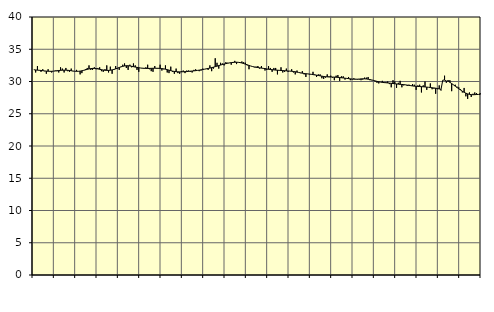
| Category | Piggar | Series 1 |
|---|---|---|
| nan | 31.8 | 31.82 |
| 1.0 | 31.4 | 31.79 |
| 1.0 | 32.4 | 31.76 |
| 1.0 | 31.7 | 31.74 |
| 1.0 | 31.5 | 31.71 |
| 1.0 | 31.9 | 31.68 |
| 1.0 | 31.6 | 31.64 |
| 1.0 | 31.2 | 31.61 |
| 1.0 | 31.9 | 31.59 |
| 1.0 | 31.6 | 31.58 |
| 1.0 | 31.4 | 31.58 |
| 1.0 | 31.6 | 31.6 |
| nan | 31.7 | 31.63 |
| 2.0 | 31.6 | 31.67 |
| 2.0 | 31.4 | 31.7 |
| 2.0 | 32.2 | 31.73 |
| 2.0 | 32 | 31.75 |
| 2.0 | 31.4 | 31.76 |
| 2.0 | 32.1 | 31.76 |
| 2.0 | 31.6 | 31.74 |
| 2.0 | 31.5 | 31.71 |
| 2.0 | 32 | 31.67 |
| 2.0 | 31.6 | 31.62 |
| 2.0 | 31.6 | 31.59 |
| nan | 31.8 | 31.58 |
| 3.0 | 31.6 | 31.58 |
| 3.0 | 31.1 | 31.61 |
| 3.0 | 31.3 | 31.66 |
| 3.0 | 31.7 | 31.73 |
| 3.0 | 31.9 | 31.8 |
| 3.0 | 32.1 | 31.88 |
| 3.0 | 32.5 | 31.95 |
| 3.0 | 31.8 | 32 |
| 3.0 | 31.8 | 32.03 |
| 3.0 | 32.2 | 32.03 |
| 3.0 | 31.9 | 32 |
| nan | 32.1 | 31.95 |
| 4.0 | 32.2 | 31.89 |
| 4.0 | 31.6 | 31.83 |
| 4.0 | 31.5 | 31.78 |
| 4.0 | 31.9 | 31.74 |
| 4.0 | 32.5 | 31.72 |
| 4.0 | 31.4 | 31.72 |
| 4.0 | 32.3 | 31.75 |
| 4.0 | 31.2 | 31.8 |
| 4.0 | 31.8 | 31.87 |
| 4.0 | 32.4 | 31.96 |
| 4.0 | 32 | 32.06 |
| nan | 31.8 | 32.17 |
| 5.0 | 32.3 | 32.27 |
| 5.0 | 32.6 | 32.35 |
| 5.0 | 32.8 | 32.41 |
| 5.0 | 32.1 | 32.45 |
| 5.0 | 31.8 | 32.44 |
| 5.0 | 32.6 | 32.41 |
| 5.0 | 32.2 | 32.36 |
| 5.0 | 32.8 | 32.3 |
| 5.0 | 32.5 | 32.24 |
| 5.0 | 31.8 | 32.19 |
| 5.0 | 31.5 | 32.14 |
| nan | 32.1 | 32.09 |
| 6.0 | 32.1 | 32.06 |
| 6.0 | 32.1 | 32.04 |
| 6.0 | 32.2 | 32.03 |
| 6.0 | 32.6 | 32.02 |
| 6.0 | 31.9 | 32.03 |
| 6.0 | 31.6 | 32.04 |
| 6.0 | 31.5 | 32.05 |
| 6.0 | 32.4 | 32.06 |
| 6.0 | 32 | 32.05 |
| 6.0 | 32.1 | 32.04 |
| 6.0 | 32.6 | 32.03 |
| nan | 31.7 | 32 |
| 7.0 | 31.9 | 31.96 |
| 7.0 | 32.5 | 31.91 |
| 7.0 | 31.4 | 31.84 |
| 7.0 | 31.3 | 31.76 |
| 7.0 | 32.3 | 31.68 |
| 7.0 | 31.5 | 31.61 |
| 7.0 | 31.2 | 31.56 |
| 7.0 | 32 | 31.53 |
| 7.0 | 31.3 | 31.5 |
| 7.0 | 31.2 | 31.49 |
| 7.0 | 31.6 | 31.5 |
| nan | 31.7 | 31.51 |
| 8.0 | 31.3 | 31.52 |
| 8.0 | 31.7 | 31.54 |
| 8.0 | 31.7 | 31.57 |
| 8.0 | 31.5 | 31.6 |
| 8.0 | 31.4 | 31.62 |
| 8.0 | 31.8 | 31.65 |
| 8.0 | 31.9 | 31.68 |
| 8.0 | 31.7 | 31.72 |
| 8.0 | 31.6 | 31.76 |
| 8.0 | 31.7 | 31.81 |
| 8.0 | 32 | 31.86 |
| nan | 31.9 | 31.91 |
| 9.0 | 32 | 31.96 |
| 9.0 | 31.8 | 32.02 |
| 9.0 | 32.5 | 32.08 |
| 9.0 | 31.6 | 32.15 |
| 9.0 | 32 | 32.22 |
| 9.0 | 33.6 | 32.3 |
| 9.0 | 32.9 | 32.38 |
| 9.0 | 32 | 32.47 |
| 9.0 | 32.9 | 32.55 |
| 9.0 | 32.8 | 32.63 |
| 9.0 | 32.5 | 32.71 |
| nan | 33 | 32.77 |
| 10.0 | 32.9 | 32.83 |
| 10.0 | 32.9 | 32.88 |
| 10.0 | 32.6 | 32.93 |
| 10.0 | 33 | 32.96 |
| 10.0 | 33.2 | 32.98 |
| 10.0 | 32.7 | 32.99 |
| 10.0 | 33 | 32.97 |
| 10.0 | 33 | 32.93 |
| 10.0 | 33.1 | 32.87 |
| 10.0 | 33 | 32.78 |
| 10.0 | 32.9 | 32.69 |
| nan | 32.5 | 32.59 |
| 11.0 | 31.9 | 32.49 |
| 11.0 | 32.4 | 32.4 |
| 11.0 | 32.3 | 32.32 |
| 11.0 | 32.2 | 32.26 |
| 11.0 | 32.3 | 32.2 |
| 11.0 | 32.4 | 32.16 |
| 11.0 | 32 | 32.12 |
| 11.0 | 32.4 | 32.08 |
| 11.0 | 32 | 32.04 |
| 11.0 | 31.7 | 32 |
| 11.0 | 31.8 | 31.95 |
| nan | 32.4 | 31.9 |
| 12.0 | 32.1 | 31.86 |
| 12.0 | 31.5 | 31.83 |
| 12.0 | 32.1 | 31.8 |
| 12.0 | 32.1 | 31.77 |
| 12.0 | 31.1 | 31.75 |
| 12.0 | 31.7 | 31.73 |
| 12.0 | 32.2 | 31.71 |
| 12.0 | 31.4 | 31.69 |
| 12.0 | 31.5 | 31.67 |
| 12.0 | 32 | 31.65 |
| 12.0 | 31.5 | 31.63 |
| nan | 31.6 | 31.61 |
| 13.0 | 31.9 | 31.59 |
| 13.0 | 31.4 | 31.55 |
| 13.0 | 31.1 | 31.51 |
| 13.0 | 31.7 | 31.45 |
| 13.0 | 31.4 | 31.4 |
| 13.0 | 31.3 | 31.34 |
| 13.0 | 31.6 | 31.29 |
| 13.0 | 31.1 | 31.25 |
| 13.0 | 30.7 | 31.21 |
| 13.0 | 31.2 | 31.18 |
| 13.0 | 31.1 | 31.15 |
| nan | 31.1 | 31.11 |
| 14.0 | 31.5 | 31.07 |
| 14.0 | 31.1 | 31.02 |
| 14.0 | 30.7 | 30.98 |
| 14.0 | 31.1 | 30.93 |
| 14.0 | 31.1 | 30.88 |
| 14.0 | 30.5 | 30.83 |
| 14.0 | 30.4 | 30.78 |
| 14.0 | 30.6 | 30.74 |
| 14.0 | 31.1 | 30.72 |
| 14.0 | 30.8 | 30.7 |
| 14.0 | 30.9 | 30.7 |
| nan | 30.6 | 30.69 |
| 15.0 | 30.2 | 30.68 |
| 15.0 | 30.9 | 30.66 |
| 15.0 | 31 | 30.64 |
| 15.0 | 30.1 | 30.61 |
| 15.0 | 30.8 | 30.58 |
| 15.0 | 30.8 | 30.55 |
| 15.0 | 30.3 | 30.51 |
| 15.0 | 30.5 | 30.48 |
| 15.0 | 30.7 | 30.45 |
| 15.0 | 30.2 | 30.41 |
| 15.0 | 30.3 | 30.38 |
| nan | 30.5 | 30.36 |
| 16.0 | 30.4 | 30.35 |
| 16.0 | 30.3 | 30.36 |
| 16.0 | 30.3 | 30.38 |
| 16.0 | 30.2 | 30.4 |
| 16.0 | 30.3 | 30.42 |
| 16.0 | 30.6 | 30.41 |
| 16.0 | 30.6 | 30.39 |
| 16.0 | 30.7 | 30.36 |
| 16.0 | 30.2 | 30.3 |
| 16.0 | 30.2 | 30.24 |
| 16.0 | 30.2 | 30.17 |
| nan | 30 | 30.09 |
| 17.0 | 29.8 | 30.02 |
| 17.0 | 29.7 | 29.96 |
| 17.0 | 29.9 | 29.91 |
| 17.0 | 30.1 | 29.86 |
| 17.0 | 29.9 | 29.83 |
| 17.0 | 29.9 | 29.81 |
| 17.0 | 30 | 29.78 |
| 17.0 | 29.6 | 29.75 |
| 17.0 | 29.1 | 29.72 |
| 17.0 | 30.2 | 29.69 |
| 17.0 | 30 | 29.65 |
| nan | 29 | 29.62 |
| 18.0 | 29.8 | 29.59 |
| 18.0 | 30.1 | 29.56 |
| 18.0 | 29.1 | 29.54 |
| 18.0 | 29.4 | 29.52 |
| 18.0 | 29.5 | 29.48 |
| 18.0 | 29.3 | 29.44 |
| 18.0 | 29.5 | 29.4 |
| 18.0 | 29.4 | 29.36 |
| 18.0 | 29.6 | 29.31 |
| 18.0 | 29.5 | 29.28 |
| 18.0 | 28.7 | 29.25 |
| nan | 29.4 | 29.23 |
| 19.0 | 29.5 | 29.22 |
| 19.0 | 28.3 | 29.2 |
| 19.0 | 29.4 | 29.18 |
| 19.0 | 30 | 29.16 |
| 19.0 | 28.7 | 29.13 |
| 19.0 | 29.1 | 29.1 |
| 19.0 | 29.7 | 29.07 |
| 19.0 | 28.8 | 29.03 |
| 19.0 | 28.9 | 29 |
| 19.0 | 28.1 | 28.96 |
| 19.0 | 28.8 | 28.91 |
| nan | 29.4 | 28.85 |
| 20.0 | 28.6 | 28.77 |
| 20.0 | 30.2 | 30.21 |
| 20.0 | 30.9 | 30.22 |
| 20.0 | 29.8 | 30.07 |
| 20.0 | 30.2 | 30.06 |
| 20.0 | 30.2 | 29.88 |
| 20.0 | 28.5 | 29.68 |
| 20.0 | 29.5 | 29.48 |
| 20.0 | 29.5 | 29.28 |
| 20.0 | 29.2 | 29.07 |
| 20.0 | 29.1 | 28.87 |
| nan | 28.8 | 28.68 |
| 21.0 | 28.3 | 28.49 |
| 21.0 | 29 | 28.33 |
| 21.0 | 27.7 | 28.19 |
| 21.0 | 27.3 | 28.08 |
| 21.0 | 28.3 | 28.01 |
| 21.0 | 27.6 | 27.96 |
| 21.0 | 28.1 | 27.95 |
| 21.0 | 28.3 | 27.96 |
| 21.0 | 28.2 | 27.98 |
| 21.0 | 28 | 27.99 |
| 21.0 | 28.2 | 27.99 |